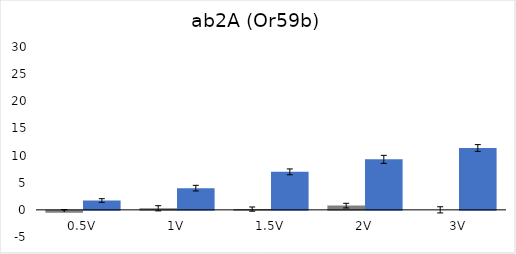
| Category | Series 0 | Series 1 |
|---|---|---|
| 0.5V | -0.36 | 1.72 |
| 1V | 0.29 | 4 |
| 1.5V | 0.14 | 7 |
| 2V | 0.78 | 9.3 |
| 3V | 0 | 11.4 |